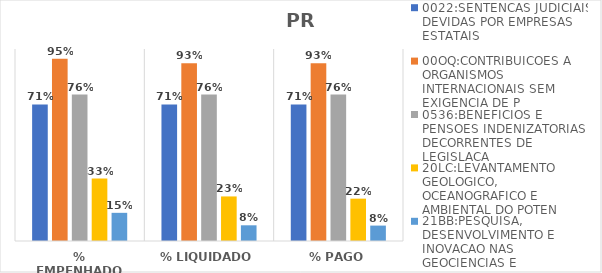
| Category | 0022:SENTENCAS JUDICIAIS DEVIDAS POR EMPRESAS ESTATAIS | 00OQ:CONTRIBUICOES A ORGANISMOS INTERNACIONAIS SEM EXIGENCIA DE P | 0536:BENEFICIOS E PENSOES INDENIZATORIAS DECORRENTES DE LEGISLACA | 20LC:LEVANTAMENTO GEOLOGICO, OCEANOGRAFICO E AMBIENTAL DO POTEN | 21BB:PESQUISA, DESENVOLVIMENTO E INOVACAO NAS GEOCIENCIAS E |
|---|---|---|---|---|---|
| % EMPENHADO | 0.711 | 0.95 | 0.763 | 0.325 | 0.147 |
| % LIQUIDADO | 0.711 | 0.926 | 0.763 | 0.232 | 0.082 |
| % PAGO | 0.711 | 0.926 | 0.763 | 0.221 | 0.08 |